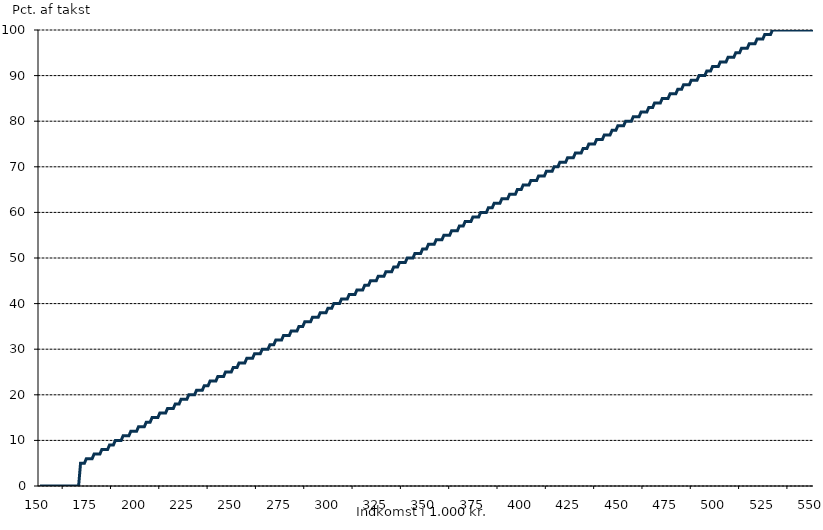
| Category | Series 0 |
|---|---|
| 150.0 | 0 |
| 151.0 | 0 |
| 152.0 | 0 |
| 153.0 | 0 |
| 154.0 | 0 |
| 155.0 | 0 |
| 156.0 | 0 |
| 157.0 | 0 |
| 158.0 | 0 |
| 159.0 | 0 |
| 160.0 | 0 |
| 161.0 | 0 |
| 162.0 | 0 |
| 163.0 | 0 |
| 164.0 | 0 |
| 165.0 | 0 |
| 166.0 | 0 |
| 167.0 | 0 |
| 168.0 | 0 |
| 169.0 | 0 |
| 170.0 | 0 |
| 171.0 | 5 |
| 172.0 | 5 |
| 173.0 | 5 |
| 174.0 | 6 |
| 175.0 | 6 |
| 176.0 | 6 |
| 177.0 | 6 |
| 178.0 | 7 |
| 179.0 | 7 |
| 180.0 | 7 |
| 181.0 | 7 |
| 182.0 | 8 |
| 183.0 | 8 |
| 184.0 | 8 |
| 185.0 | 8 |
| 186.0 | 9 |
| 187.0 | 9 |
| 188.0 | 9 |
| 189.0 | 10 |
| 190.0 | 10 |
| 191.0 | 10 |
| 192.0 | 10 |
| 193.0 | 11 |
| 194.0 | 11 |
| 195.0 | 11 |
| 196.0 | 11 |
| 197.0 | 12 |
| 198.0 | 12 |
| 199.0 | 12 |
| 200.0 | 12 |
| 201.0 | 13 |
| 202.0 | 13 |
| 203.0 | 13 |
| 204.0 | 13 |
| 205.0 | 14 |
| 206.0 | 14 |
| 207.0 | 14 |
| 208.0 | 15 |
| 209.0 | 15 |
| 210.0 | 15 |
| 211.0 | 15 |
| 212.0 | 16 |
| 213.0 | 16 |
| 214.0 | 16 |
| 215.0 | 16 |
| 216.0 | 17 |
| 217.0 | 17 |
| 218.0 | 17 |
| 219.0 | 17 |
| 220.0 | 18 |
| 221.0 | 18 |
| 222.0 | 18 |
| 223.0 | 19 |
| 224.0 | 19 |
| 225.0 | 19 |
| 226.0 | 19 |
| 227.0 | 20 |
| 228.0 | 20 |
| 229.0 | 20 |
| 230.0 | 20 |
| 231.0 | 21 |
| 232.0 | 21 |
| 233.0 | 21 |
| 234.0 | 21 |
| 235.0 | 22 |
| 236.0 | 22 |
| 237.0 | 22 |
| 238.0 | 23 |
| 239.0 | 23 |
| 240.0 | 23 |
| 241.0 | 23 |
| 242.0 | 24 |
| 243.0 | 24 |
| 244.0 | 24 |
| 245.0 | 24 |
| 246.0 | 25 |
| 247.0 | 25 |
| 248.0 | 25 |
| 249.0 | 25 |
| 250.0 | 26 |
| 251.0 | 26 |
| 252.0 | 26 |
| 253.0 | 27 |
| 254.0 | 27 |
| 255.0 | 27 |
| 256.0 | 27 |
| 257.0 | 28 |
| 258.0 | 28 |
| 259.0 | 28 |
| 260.0 | 28 |
| 261.0 | 29 |
| 262.0 | 29 |
| 263.0 | 29 |
| 264.0 | 29 |
| 265.0 | 30 |
| 266.0 | 30 |
| 267.0 | 30 |
| 268.0 | 30 |
| 269.0 | 31 |
| 270.0 | 31 |
| 271.0 | 31 |
| 272.0 | 32 |
| 273.0 | 32 |
| 274.0 | 32 |
| 275.0 | 32 |
| 276.0 | 33 |
| 277.0 | 33 |
| 278.0 | 33 |
| 279.0 | 33 |
| 280.0 | 34 |
| 281.0 | 34 |
| 282.0 | 34 |
| 283.0 | 34 |
| 284.0 | 35 |
| 285.0 | 35 |
| 286.0 | 35 |
| 287.0 | 36 |
| 288.0 | 36 |
| 289.0 | 36 |
| 290.0 | 36 |
| 291.0 | 37 |
| 292.0 | 37 |
| 293.0 | 37 |
| 294.0 | 37 |
| 295.0 | 38 |
| 296.0 | 38 |
| 297.0 | 38 |
| 298.0 | 38 |
| 299.0 | 39 |
| 300.0 | 39 |
| 301.0 | 39 |
| 302.0 | 40 |
| 303.0 | 40 |
| 304.0 | 40 |
| 305.0 | 40 |
| 306.0 | 41 |
| 307.0 | 41 |
| 308.0 | 41 |
| 309.0 | 41 |
| 310.0 | 42 |
| 311.0 | 42 |
| 312.0 | 42 |
| 313.0 | 42 |
| 314.0 | 43 |
| 315.0 | 43 |
| 316.0 | 43 |
| 317.0 | 43 |
| 318.0 | 44 |
| 319.0 | 44 |
| 320.0 | 44 |
| 321.0 | 45 |
| 322.0 | 45 |
| 323.0 | 45 |
| 324.0 | 45 |
| 325.0 | 46 |
| 326.0 | 46 |
| 327.0 | 46 |
| 328.0 | 46 |
| 329.0 | 47 |
| 330.0 | 47 |
| 331.0 | 47 |
| 332.0 | 47 |
| 333.0 | 48 |
| 334.0 | 48 |
| 335.0 | 48 |
| 336.0 | 49 |
| 337.0 | 49 |
| 338.0 | 49 |
| 339.0 | 49 |
| 340.0 | 50 |
| 341.0 | 50 |
| 342.0 | 50 |
| 343.0 | 50 |
| 344.0 | 51 |
| 345.0 | 51 |
| 346.0 | 51 |
| 347.0 | 51 |
| 348.0 | 52 |
| 349.0 | 52 |
| 350.0 | 52 |
| 351.0 | 53 |
| 352.0 | 53 |
| 353.0 | 53 |
| 354.0 | 53 |
| 355.0 | 54 |
| 356.0 | 54 |
| 357.0 | 54 |
| 358.0 | 54 |
| 359.0 | 55 |
| 360.0 | 55 |
| 361.0 | 55 |
| 362.0 | 55 |
| 363.0 | 56 |
| 364.0 | 56 |
| 365.0 | 56 |
| 366.0 | 56 |
| 367.0 | 57 |
| 368.0 | 57 |
| 369.0 | 57 |
| 370.0 | 58 |
| 371.0 | 58 |
| 372.0 | 58 |
| 373.0 | 58 |
| 374.0 | 59 |
| 375.0 | 59 |
| 376.0 | 59 |
| 377.0 | 59 |
| 378.0 | 60 |
| 379.0 | 60 |
| 380.0 | 60 |
| 381.0 | 60 |
| 382.0 | 61 |
| 383.0 | 61 |
| 384.0 | 61 |
| 385.0 | 62 |
| 386.0 | 62 |
| 387.0 | 62 |
| 388.0 | 62 |
| 389.0 | 63 |
| 390.0 | 63 |
| 391.0 | 63 |
| 392.0 | 63 |
| 393.0 | 64 |
| 394.0 | 64 |
| 395.0 | 64 |
| 396.0 | 64 |
| 397.0 | 65 |
| 398.0 | 65 |
| 399.0 | 65 |
| 400.0 | 66 |
| 401.0 | 66 |
| 402.0 | 66 |
| 403.0 | 66 |
| 404.0 | 67 |
| 405.0 | 67 |
| 406.0 | 67 |
| 407.0 | 67 |
| 408.0 | 68 |
| 409.0 | 68 |
| 410.0 | 68 |
| 411.0 | 68 |
| 412.0 | 69 |
| 413.0 | 69 |
| 414.0 | 69 |
| 415.0 | 69 |
| 416.0 | 70 |
| 417.0 | 70 |
| 418.0 | 70 |
| 419.0 | 71 |
| 420.0 | 71 |
| 421.0 | 71 |
| 422.0 | 71 |
| 423.0 | 72 |
| 424.0 | 72 |
| 425.0 | 72 |
| 426.0 | 72 |
| 427.0 | 73 |
| 428.0 | 73 |
| 429.0 | 73 |
| 430.0 | 73 |
| 431.0 | 74 |
| 432.0 | 74 |
| 433.0 | 74 |
| 434.0 | 75 |
| 435.0 | 75 |
| 436.0 | 75 |
| 437.0 | 75 |
| 438.0 | 76 |
| 439.0 | 76 |
| 440.0 | 76 |
| 441.0 | 76 |
| 442.0 | 77 |
| 443.0 | 77 |
| 444.0 | 77 |
| 445.0 | 77 |
| 446.0 | 78 |
| 447.0 | 78 |
| 448.0 | 78 |
| 449.0 | 79 |
| 450.0 | 79 |
| 451.0 | 79 |
| 452.0 | 79 |
| 453.0 | 80 |
| 454.0 | 80 |
| 455.0 | 80 |
| 456.0 | 80 |
| 457.0 | 81 |
| 458.0 | 81 |
| 459.0 | 81 |
| 460.0 | 81 |
| 461.0 | 82 |
| 462.0 | 82 |
| 463.0 | 82 |
| 464.0 | 82 |
| 465.0 | 83 |
| 466.0 | 83 |
| 467.0 | 83 |
| 468.0 | 84 |
| 469.0 | 84 |
| 470.0 | 84 |
| 471.0 | 84 |
| 472.0 | 85 |
| 473.0 | 85 |
| 474.0 | 85 |
| 475.0 | 85 |
| 476.0 | 86 |
| 477.0 | 86 |
| 478.0 | 86 |
| 479.0 | 86 |
| 480.0 | 87 |
| 481.0 | 87 |
| 482.0 | 87 |
| 483.0 | 88 |
| 484.0 | 88 |
| 485.0 | 88 |
| 486.0 | 88 |
| 487.0 | 89 |
| 488.0 | 89 |
| 489.0 | 89 |
| 490.0 | 89 |
| 491.0 | 90 |
| 492.0 | 90 |
| 493.0 | 90 |
| 494.0 | 90 |
| 495.0 | 91 |
| 496.0 | 91 |
| 497.0 | 91 |
| 498.0 | 92 |
| 499.0 | 92 |
| 500.0 | 92 |
| 501.0 | 92 |
| 502.0 | 93 |
| 503.0 | 93 |
| 504.0 | 93 |
| 505.0 | 93 |
| 506.0 | 94 |
| 507.0 | 94 |
| 508.0 | 94 |
| 509.0 | 94 |
| 510.0 | 95 |
| 511.0 | 95 |
| 512.0 | 95 |
| 513.0 | 96 |
| 514.0 | 96 |
| 515.0 | 96 |
| 516.0 | 96 |
| 517.0 | 97 |
| 518.0 | 97 |
| 519.0 | 97 |
| 520.0 | 97 |
| 521.0 | 98 |
| 522.0 | 98 |
| 523.0 | 98 |
| 524.0 | 98 |
| 525.0 | 99 |
| 526.0 | 99 |
| 527.0 | 99 |
| 528.0 | 99 |
| 529.0 | 100 |
| 530.0 | 100 |
| 531.0 | 100 |
| 532.0 | 100 |
| 533.0 | 100 |
| 534.0 | 100 |
| 535.0 | 100 |
| 536.0 | 100 |
| 537.0 | 100 |
| 538.0 | 100 |
| 539.0 | 100 |
| 540.0 | 100 |
| 541.0 | 100 |
| 542.0 | 100 |
| 543.0 | 100 |
| 544.0 | 100 |
| 545.0 | 100 |
| 546.0 | 100 |
| 547.0 | 100 |
| 548.0 | 100 |
| 549.0 | 100 |
| 550.0 | 100 |